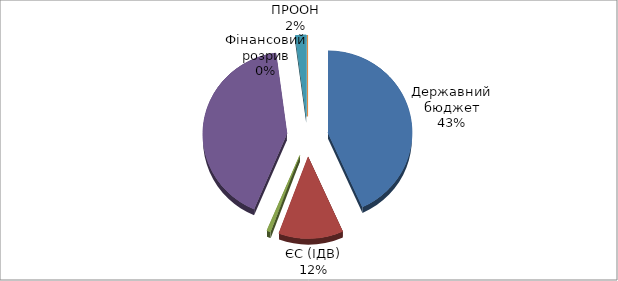
| Category | Series 0 |
|---|---|
| Державний бюджет | 18818158.401 |
| ЄС (ІДВ) | 5394266.25 |
| Донори (РЄ+) | 315000 |
| Світовий банк | 18053278 |
| ПРООН | 916078 |
| Фінансовий розрив | 0 |